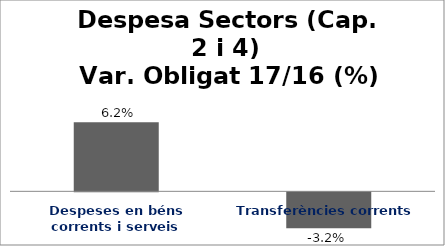
| Category | Series 0 |
|---|---|
| Despeses en béns corrents i serveis | 0.062 |
| Transferències corrents | -0.032 |